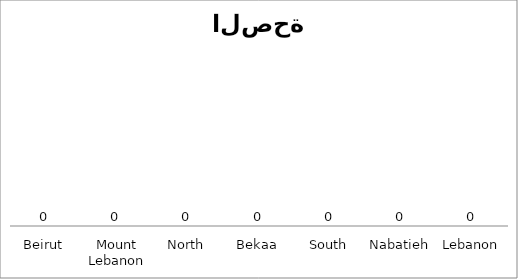
| Category | Series 0 |
|---|---|
| Beirut | 0 |
| Mount Lebanon | 0 |
| North | 0 |
| Bekaa | 0 |
| South | 0 |
| Nabatieh | 0 |
| Lebanon | 0 |